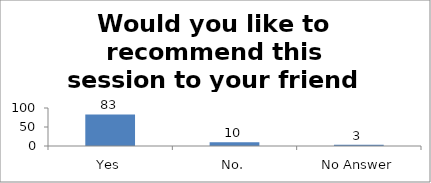
| Category | Would you like to recommend this session to your friend or colleague? |
|---|---|
| Yes | 83 |
| No. | 10 |
| No Answer | 3 |